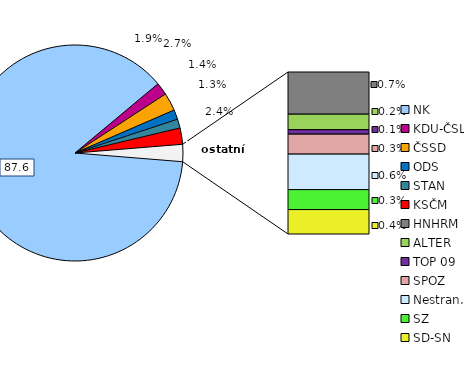
| Category | kandidáti |
|---|---|
| NK | 2483 |
| KDU-ČSL | 53 |
| ČSSD | 76 |
| ODS | 41 |
| STAN | 38 |
| KSČM | 69 |
| HNHRM | 19 |
| ALTER | 7 |
| TOP 09 | 2 |
| SPOZ | 9 |
| Nestran. | 16 |
| SZ | 9 |
| SD-SN | 11 |